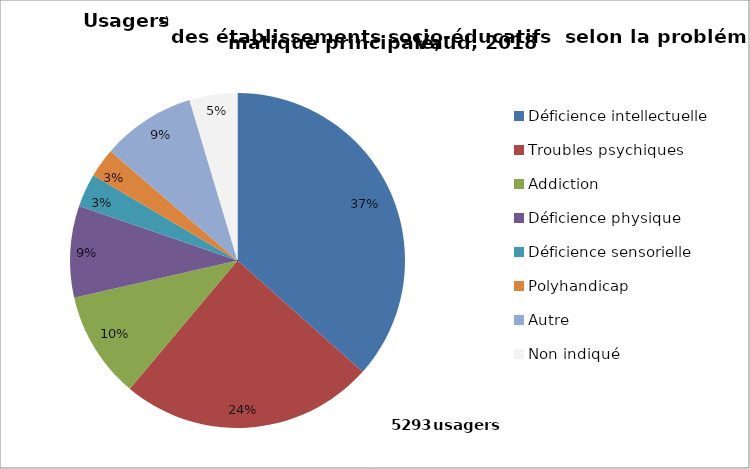
| Category | Series 0 |
|---|---|
| Déficience intellectuelle | 1936 |
| Troubles psychiques | 1299 |
| Addiction | 546 |
| Déficience physique | 468 |
| Déficience sensorielle | 170 |
| Polyhandicap | 150 |
| Autre | 479 |
| Non indiqué | 245 |